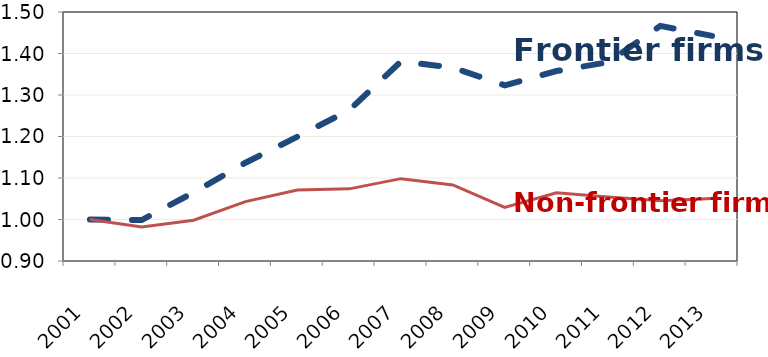
| Category | Average | Non-frontier |
|---|---|---|
| 2001.0 | 1 | 1 |
| 2002.0 | 0.999 | 0.982 |
| 2003.0 | 1.065 | 0.998 |
| 2004.0 | 1.137 | 1.043 |
| 2005.0 | 1.199 | 1.071 |
| 2006.0 | 1.263 | 1.074 |
| 2007.0 | 1.381 | 1.098 |
| 2008.0 | 1.366 | 1.083 |
| 2009.0 | 1.323 | 1.029 |
| 2010.0 | 1.358 | 1.065 |
| 2011.0 | 1.379 | 1.054 |
| 2012.0 | 1.466 | 1.045 |
| 2013.0 | 1.442 | 1.05 |